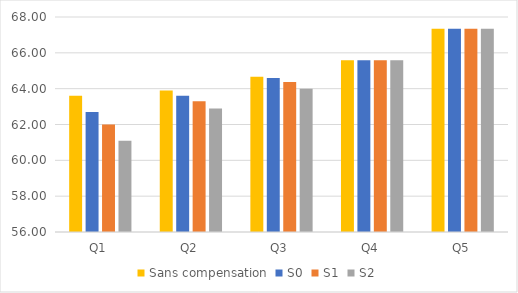
| Category | Sans compensation | S0 | S1 | S2 |
|---|---|---|---|---|
| Q1 | 63.6 | 62.7 | 62 | 61.1 |
| Q2 | 63.9 | 63.6 | 63.3 | 62.9 |
| Q3 | 64.67 | 64.595 | 64.37 | 63.995 |
| Q4 | 65.59 | 65.59 | 65.59 | 65.59 |
| Q5 | 67.35 | 67.35 | 67.35 | 67.35 |